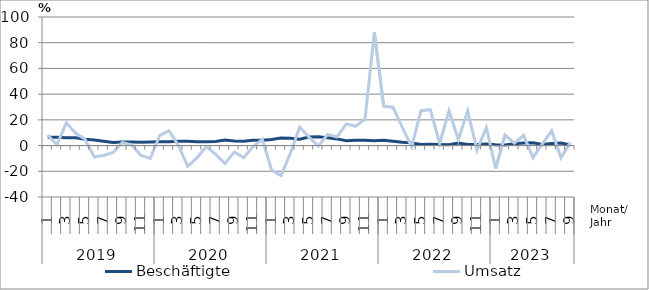
| Category | Beschäftigte | Umsatz |
|---|---|---|
| 0 | 6.4 | 8.2 |
| 1 | 6.5 | 0.6 |
| 2 | 6 | 17.8 |
| 3 | 6.1 | 9.6 |
| 4 | 4.9 | 4.9 |
| 5 | 4.3 | -8.8 |
| 6 | 3.3 | -7.7 |
| 7 | 2.4 | -5.4 |
| 8 | 2.8 | 2.4 |
| 9 | 2.7 | 0.5 |
| 10 | 2.5 | -7.6 |
| 11 | 2.7 | -10 |
| 12 | 2.9 | 7.8 |
| 13 | 2.9 | 11.5 |
| 14 | 3.4 | 0.1 |
| 15 | 3.4 | -16.1 |
| 16 | 2.9 | -9.5 |
| 17 | 2.9 | -0.8 |
| 18 | 3.1 | -6.9 |
| 19 | 4.3 | -14 |
| 20 | 3.6 | -4.9 |
| 21 | 3.4 | -9.4 |
| 22 | 4.1 | -0.9 |
| 23 | 4.1 | 4.9 |
| 24 | 4.8 | -19.1 |
| 25 | 5.8 | -23.3 |
| 26 | 5.6 | -6.1 |
| 27 | 5 | 14.4 |
| 28 | 6.6 | 6.6 |
| 29 | 6.9 | -0.3 |
| 30 | 6 | 8.7 |
| 31 | 5.2 | 6.7 |
| 32 | 3.8 | 16.9 |
| 33 | 4.2 | 15 |
| 34 | 4.2 | 20.6 |
| 35 | 3.7 | 88.1 |
| 36 | 4.1 | 30.7 |
| 37 | 3.4 | 29.8 |
| 38 | 2.6 | 14.1 |
| 39 | 2.1 | -1.1 |
| 40 | 0.9 | 27.1 |
| 41 | 1 | 27.9 |
| 42 | 0.8 | 1.7 |
| 43 | 0.7 | 27 |
| 44 | 2 | 4.7 |
| 45 | 0.9 | 27.1 |
| 46 | 0.9 | -3.5 |
| 47 | 1.2 | 14.1 |
| 48 | 0.6 | -17.8 |
| 49 | 0.5 | 8.2 |
| 50 | 1.4 | 1.9 |
| 51 | 2 | 7.9 |
| 52 | 2.2 | -9.4 |
| 53 | 0.9 | 1.3 |
| 54 | 1.6 | 11.5 |
| 55 | 2 | -9.6 |
| 56 | 0.5 | 2.5 |